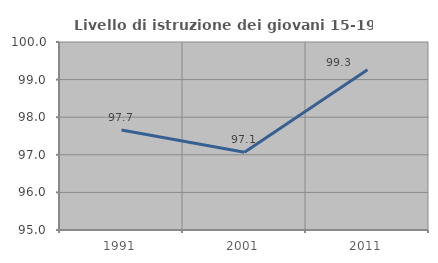
| Category | Livello di istruzione dei giovani 15-19 anni |
|---|---|
| 1991.0 | 97.658 |
| 2001.0 | 97.068 |
| 2011.0 | 99.264 |